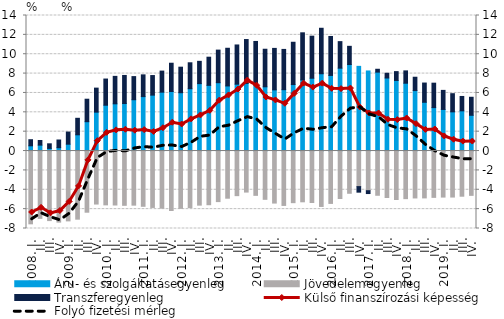
| Category | Áru- és szolgáltatásegyenleg | Jövedelemegyenleg | Transzferegyenleg |
|---|---|---|---|
| 2008. I. | 0.541 | -7.517 | 0.63 |
|          II. | 0.61 | -6.952 | 0.477 |
|          III. | 0.274 | -7.183 | 0.474 |
|          IV. | 0.347 | -7.34 | 0.794 |
| 2009. I. | 0.707 | -7.213 | 1.254 |
|          II. | 1.678 | -7.037 | 1.705 |
|          III. | 3.032 | -6.318 | 2.322 |
|          IV. | 4.018 | -5.474 | 2.481 |
| 2010. I. | 4.733 | -5.559 | 2.704 |
|          II. | 4.878 | -5.574 | 2.835 |
|          III. | 4.907 | -5.606 | 2.9 |
|          IV. | 5.301 | -5.589 | 2.389 |
| 2011. I. | 5.624 | -5.706 | 2.245 |
|          II. | 5.775 | -5.824 | 2.023 |
|          III. | 6.081 | -5.899 | 2.176 |
|          IV. | 6.149 | -6.144 | 2.922 |
| 2012. I. | 6.025 | -5.919 | 2.637 |
|          II. | 6.439 | -5.84 | 2.678 |
|          III. | 6.964 | -5.588 | 2.302 |
|          IV. | 6.784 | -5.544 | 2.91 |
| 2013. I. | 7.06 | -5.222 | 3.365 |
| II. | 6.724 | -4.871 | 3.891 |
|          III. | 6.907 | -4.607 | 4.049 |
| IV. | 6.986 | -4.238 | 4.531 |
| 2014. I. | 7.05 | -4.575 | 4.269 |
| II. | 6.636 | -4.987 | 3.879 |
|          III. | 6.319 | -5.374 | 4.283 |
| IV. | 6.338 | -5.617 | 4.159 |
| 2015. I. | 6.867 | -5.332 | 4.369 |
| II. | 7.345 | -5.243 | 4.867 |
|          III. | 7.52 | -5.314 | 4.345 |
| IV. | 7.984 | -5.723 | 4.697 |
| 2016. I. | 7.809 | -5.409 | 4.026 |
| II. | 8.56 | -4.903 | 2.741 |
|          III. | 8.935 | -4.362 | 1.88 |
| IV. | 8.747 | -3.673 | -0.574 |
| 2017. I. | 8.271 | -4.098 | -0.292 |
| II. | 8.152 | -4.569 | 0.294 |
|          III. | 7.545 | -4.8 | 0.49 |
| IV. | 7.291 | -5.008 | 0.913 |
| 2018. I. | 7.006 | -4.917 | 1.273 |
| II. | 6.247 | -4.844 | 1.377 |
|          III. | 5.038 | -4.84 | 1.986 |
| IV. | 4.489 | -4.784 | 2.521 |
| 2019. I. | 4.296 | -4.755 | 1.969 |
| II. | 4.049 | -4.753 | 1.875 |
|          III. | 4.154 | -4.665 | 1.483 |
| IV. | 3.692 | -4.577 | 1.863 |